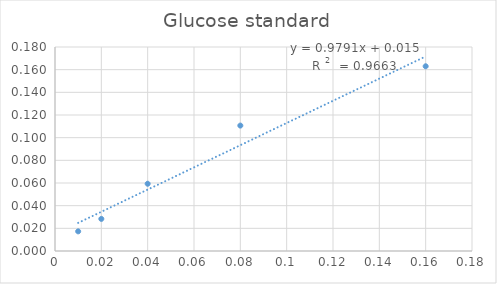
| Category | Series 0 |
|---|---|
| 0.01 | 0.017 |
| 0.02 | 0.028 |
| 0.04 | 0.059 |
| 0.08 | 0.111 |
| 0.16 | 0.163 |